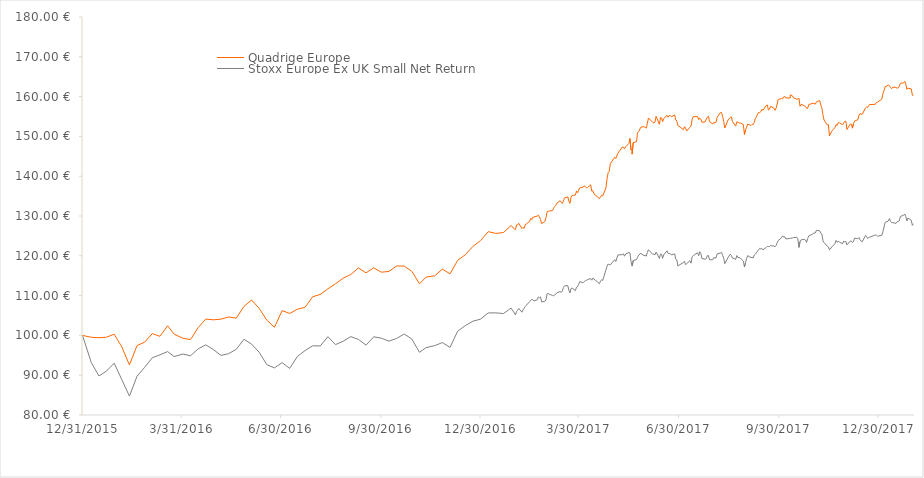
| Category |  Quadrige Europe     |  Stoxx Europe Ex UK Small Net Return  |
|---|---|---|
| 12/31/15 | 100 | 100 |
| 1/8/16 | 99.53 | 93.186 |
| 1/15/16 | 99.42 | 89.81 |
| 1/22/16 | 99.55 | 91.035 |
| 1/29/16 | 100.31 | 93.024 |
| 2/5/16 | 97.11 | 88.883 |
| 2/12/16 | 92.59 | 84.746 |
| 2/19/16 | 97.46 | 89.771 |
| 2/26/16 | 98.31 | 91.98 |
| 3/4/16 | 100.46 | 94.39 |
| 3/11/16 | 99.77 | 95.116 |
| 3/18/16 | 102.42 | 95.935 |
| 3/24/16 | 100.32 | 94.673 |
| 4/1/16 | 99.28 | 95.319 |
| 4/8/16 | 98.94 | 94.872 |
| 4/15/16 | 101.95 | 96.62 |
| 4/22/16 | 104.09 | 97.627 |
| 4/29/16 | 103.92 | 96.434 |
| 5/6/16 | 104.08 | 94.964 |
| 5/13/16 | 104.63 | 95.412 |
| 5/20/16 | 104.33 | 96.51 |
| 5/27/16 | 107.27 | 99.025 |
| 6/3/16 | 108.9 | 97.822 |
| 6/10/16 | 106.78 | 95.755 |
| 6/17/16 | 103.83 | 92.646 |
| 6/24/16 | 102.03 | 91.833 |
| 7/1/16 | 106.22 | 93.156 |
| 7/8/16 | 105.52 | 91.714 |
| 7/15/16 | 106.58 | 94.707 |
| 7/22/16 | 107.04 | 96.186 |
| 7/29/16 | 109.71 | 97.385 |
| 8/5/16 | 110.29 | 97.348 |
| 8/12/16 | 111.7 | 99.682 |
| 8/19/16 | 112.97 | 97.683 |
| 8/26/16 | 114.38 | 98.537 |
| 9/2/16 | 115.3 | 99.693 |
| 9/9/16 | 116.95 | 98.993 |
| 9/16/16 | 115.72 | 97.554 |
| 9/23/16 | 116.98 | 99.646 |
| 9/30/16 | 115.88 | 99.306 |
| 10/7/16 | 116.07 | 98.55 |
| 10/14/16 | 117.45 | 99.231 |
| 10/21/16 | 117.41 | 100.348 |
| 10/28/16 | 116.11 | 99.094 |
| 11/4/16 | 112.96 | 95.749 |
| 11/10/16 | 114.64 | 96.922 |
| 11/18/16 | 114.99 | 97.437 |
| 11/25/16 | 116.66 | 98.2 |
| 12/2/16 | 115.47 | 96.974 |
| 12/9/16 | 118.85 | 101.063 |
| 12/16/16 | 120.26 | 102.444 |
| 12/23/16 | 122.36 | 103.564 |
| 12/30/16 | 123.81 | 104.089 |
| 1/6/17 | 126.06 | 105.639 |
| 1/13/17 | 125.63 | 105.667 |
| 1/20/17 | 125.84 | 105.481 |
| 1/27/17 | 127.62 | 106.868 |
| 1/30/17 | 126.7 | 105.623 |
| 1/31/17 | 126.57 | 105.126 |
| 2/1/17 | 127.78 | 106.058 |
| 2/2/17 | 127.81 | 106.291 |
| 2/3/17 | 128.17 | 106.762 |
| 2/6/17 | 126.85 | 105.827 |
| 2/7/17 | 127.16 | 106.445 |
| 2/8/17 | 126.91 | 106.819 |
| 2/9/17 | 127.85 | 107.249 |
| 2/10/17 | 128 | 107.558 |
| 2/13/17 | 128.62 | 108.502 |
| 2/14/17 | 129.45 | 108.857 |
| 2/15/17 | 129.13 | 109.04 |
| 2/16/17 | 129.71 | 108.969 |
| 2/17/17 | 129.74 | 108.658 |
| 2/20/17 | 130 | 108.958 |
| 2/21/17 | 130.21 | 109.684 |
| 2/22/17 | 129.76 | 109.459 |
| 2/23/17 | 129.15 | 109.671 |
| 2/24/17 | 128.09 | 108.407 |
| 2/27/17 | 128.61 | 108.57 |
| 2/28/17 | 129.59 | 108.9 |
| 3/1/17 | 131.04 | 110.46 |
| 3/2/17 | 131.18 | 110.56 |
| 3/3/17 | 131.27 | 110.33 |
| 3/6/17 | 131.34 | 110.05 |
| 3/7/17 | 131.94 | 109.95 |
| 3/8/17 | 132.4 | 110.1 |
| 3/9/17 | 132.69 | 110.4 |
| 3/10/17 | 133.23 | 110.71 |
| 3/13/17 | 133.82 | 111 |
| 3/14/17 | 133.45 | 110.8 |
| 3/15/17 | 133.14 | 111.16 |
| 3/16/17 | 133.75 | 112.04 |
| 3/17/17 | 134.56 | 112.45 |
| 3/20/17 | 134.8 | 112.52 |
| 3/21/17 | 133.73 | 111.36 |
| 3/22/17 | 133.17 | 110.66 |
| 3/23/17 | 134.76 | 111.78 |
| 3/24/17 | 135.17 | 111.89 |
| 3/27/17 | 135.25 | 111.24 |
| 3/28/17 | 136.3 | 112.14 |
| 3/29/17 | 135.83 | 112.25 |
| 3/30/17 | 136.54 | 112.84 |
| 3/31/17 | 137.07 | 113.53 |
| 4/3/17 | 137.28 | 113.21 |
| 4/4/17 | 137.52 | 113.49 |
| 4/5/17 | 137.4 | 113.75 |
| 4/6/17 | 137.08 | 113.85 |
| 4/7/17 | 137.12 | 114 |
| 4/10/17 | 137.84 | 114.29 |
| 4/11/17 | 136.25 | 113.87 |
| 4/12/17 | 136.38 | 114.4 |
| 4/13/17 | 135.57 | 114.17 |
| 4/18/17 | 134.36 | 113.01 |
| 4/19/17 | 134.8 | 113.64 |
| 4/20/17 | 135.23 | 113.99 |
| 4/21/17 | 135 | 113.81 |
| 4/24/17 | 137.05 | 116.49 |
| 4/25/17 | 139.34 | 117.33 |
| 4/26/17 | 140.88 | 117.91 |
| 4/27/17 | 141.24 | 117.78 |
| 4/28/17 | 143.14 | 117.72 |
| 5/2/17 | 144.79 | 119.02 |
| 5/3/17 | 144.45 | 118.56 |
| 5/5/17 | 145.8 | 120.19 |
| 5/9/17 | 147.32 | 120.31 |
| 5/10/17 | 147.28 | 120.49 |
| 5/11/17 | 146.85 | 119.9 |
| 5/12/17 | 147.39 | 120.47 |
| 5/15/17 | 148.21 | 120.83 |
| 5/16/17 | 149.47 | 120.71 |
| 5/17/17 | 146.55 | 118.52 |
| 5/17/17 | 146.55 | 118.52 |
| 5/18/17 | 146.55 | 117.41 |
| 5/18/17 | 146.55 | 117.41 |
| 5/18/17 | 145.54 | 117.41 |
| 5/19/17 | 148.45 | 118.82 |
| 5/22/17 | 148.65 | 119.04 |
| 5/23/17 | 151 | 119.65 |
| 5/24/17 | 151.19 | 120.17 |
| 5/26/17 | 152.33 | 120.63 |
| 5/29/17 | 152.45 | 120.01 |
| 5/30/17 | 152.26 | 120.15 |
| 5/31/17 | 152.08 | 119.9 |
| 6/1/17 | 153.35 | 120.89 |
| 6/2/17 | 154.62 | 121.53 |
| 6/6/17 | 153.5 | 120.35 |
| 6/7/17 | 153.38 | 120.46 |
| 6/8/17 | 153.63 | 120.25 |
| 6/9/17 | 155.05 | 120.94 |
| 6/12/17 | 153.04 | 119.34 |
| 6/13/17 | 154.75 | 120.4 |
| 6/14/17 | 154.63 | 120.39 |
| 6/15/17 | 153.7 | 119.37 |
| 6/16/17 | 154.51 | 120.25 |
| 6/19/17 | 155.31 | 121.26 |
| 6/20/17 | 154.8 | 120.61 |
| 6/21/17 | 155.22 | 120.58 |
| 6/22/17 | 155.25 | 120.53 |
| 6/23/17 | 154.92 | 120.22 |
| 6/26/17 | 155.41 | 120.49 |
| 6/27/17 | 154.18 | 119.17 |
| 6/28/17 | 153.86 | 118.95 |
| 6/29/17 | 152.71 | 117.38 |
| 6/30/17 | 152.57 | 117.64 |
| 7/4/17 | 151.69 | 118.29 |
| 7/5/17 | 152.45 | 118.64 |
| 7/6/17 | 152.12 | 117.81 |
| 7/7/17 | 151.35 | 118 |
| 7/10/17 | 152.31 | 118.78 |
| 7/11/17 | 152.59 | 118.16 |
| 7/12/17 | 154.25 | 119.74 |
| 7/13/17 | 154.95 | 120.02 |
| 7/17/17 | 154.99 | 120.77 |
| 7/18/17 | 154.21 | 120.03 |
| 7/19/17 | 154.6 | 121.03 |
| 7/20/17 | 154.36 | 120.58 |
| 7/21/17 | 153.55 | 119.33 |
| 7/24/17 | 153.66 | 119.13 |
| 7/25/17 | 154.34 | 119.28 |
| 7/26/17 | 154.85 | 120.06 |
| 7/27/17 | 155.06 | 120.04 |
| 7/28/17 | 153.71 | 118.97 |
| 7/31/17 | 153.13 | 119.05 |
| 8/1/17 | 153.55 | 119.59 |
| 8/2/17 | 153.32 | 119.43 |
| 8/3/17 | 153.6 | 119.49 |
| 8/4/17 | 154.83 | 120.49 |
| 8/7/17 | 156.02 | 120.7 |
| 8/8/17 | 156.01 | 120.87 |
| 8/9/17 | 154.97 | 120.07 |
| 8/10/17 | 153.8 | 119.38 |
| 8/11/17 | 152.12 | 118.02 |
| 8/14/17 | 154.15 | 119.57 |
| 8/16/17 | 154.77 | 120.42 |
| 8/17/17 | 154.91 | 120.07 |
| 8/18/17 | 153.71 | 119.43 |
| 8/21/17 | 152.61 | 119.12 |
| 8/22/17 | 153.66 | 120.06 |
| 8/23/17 | 153.58 | 119.56 |
| 8/24/17 | 153.3 | 119.54 |
| 8/25/17 | 153.43 | 119.49 |
| 8/28/17 | 152.95 | 118.68 |
| 8/29/17 | 150.48 | 117.18 |
| 8/30/17 | 151.64 | 118.24 |
| 8/31/17 | 152.3 | 119.34 |
| 9/1/17 | 153.1 | 120.03 |
| 9/4/17 | 152.74 | 119.54 |
| 9/5/17 | 153.04 | 119.63 |
| 9/6/17 | 152.97 | 119.44 |
| 9/7/17 | 153.51 | 120.19 |
| 9/8/17 | 154.45 | 120.44 |
| 9/11/17 | 156.07 | 121.51 |
| 9/12/17 | 155.96 | 121.89 |
| 9/13/17 | 156.21 | 121.71 |
| 9/14/17 | 156.81 | 121.85 |
| 9/15/17 | 156.56 | 121.48 |
| 9/18/17 | 157.79 | 122.11 |
| 9/19/17 | 157.9 | 122.39 |
| 9/20/17 | 156.63 | 122.32 |
| 9/21/17 | 156.84 | 122.34 |
| 9/22/17 | 157.57 | 122.55 |
| 9/25/17 | 157.1 | 122.47 |
| 9/26/17 | 156.55 | 122.26 |
| 9/27/17 | 157.08 | 122.6 |
| 9/28/17 | 158.11 | 123.25 |
| 9/29/17 | 159.27 | 123.85 |
| 10/2/17 | 159.55 | 124.53 |
| 10/3/17 | 159.42 | 125.02 |
| 10/4/17 | 159.95 | 124.7 |
| 10/5/17 | 160.04 | 124.81 |
| 10/6/17 | 159.66 | 124.24 |
| 10/9/17 | 159.67 | 124.33 |
| 10/10/17 | 159.65 | 124.41 |
| 10/10/17 | 160.44 | 124.5 |
| 10/12/17 | 160.2 | 124.47 |
| 10/13/17 | 159.67 | 124.6 |
| 10/16/17 | 159.38 | 124.64 |
| 10/17/17 | 159.36 | 124.24 |
| 10/18/17 | 159.6 | 122.11 |
| 10/19/17 | 157.56 | 123.58 |
| 10/20/17 | 158.03 | 124.03 |
| 10/23/17 | 157.71 | 124.1 |
| 10/24/17 | 157.53 | 123.98 |
| 10/25/17 | 157.06 | 123.37 |
| 10/26/17 | 157.04 | 124.33 |
| 10/27/17 | 158 | 125 |
| 10/30/17 | 158.25 | 125.36 |
| 10/31/17 | 158.34 | 125.62 |
| 11/2/17 | 158.1 | 125.74 |
| 11/3/17 | 158.69 | 126.41 |
| 11/6/17 | 159 | 126.29 |
| 11/7/17 | 157.89 | 125.67 |
| 11/8/17 | 157.18 | 125.47 |
| 11/9/17 | 155.44 | 123.79 |
| 11/10/17 | 154.12 | 123.32 |
| 11/13/17 | 152.87 | 122.42 |
| 11/14/17 | 152.96 | 122.25 |
| 11/15/17 | 150.11 | 121.47 |
| 11/17/17 | 151.28 | 122.21 |
| 11/20/17 | 152.2 | 123.05 |
| 11/21/17 | 152.96 | 123.89 |
| 11/22/17 | 152.78 | 123.41 |
| 11/23/17 | 153.46 | 123.64 |
| 11/24/17 | 153.45 | 123.47 |
| 11/27/17 | 152.92 | 123.01 |
| 11/28/17 | 153.34 | 123.71 |
| 11/29/17 | 153.77 | 123.49 |
| 11/30/17 | 153.83 | 123.6 |
| 12/1/17 | 151.74 | 122.74 |
| 12/4/17 | 153.07 | 123.68 |
| 12/5/17 | 153.06 | 123.7 |
| 12/6/17 | 152.07 | 123.34 |
| 12/7/17 | 153.22 | 123.55 |
| 12/8/17 | 153.87 | 124.44 |
| 12/11/17 | 154.18 | 124.3 |
| 12/12/17 | 155.28 | 124.6 |
| 12/13/17 | 155.73 | 123.97 |
| 12/15/17 | 155.52 | 123.51 |
| 12/18/17 | 157.15 | 125.08 |
| 12/19/17 | 157.42 | 124.89 |
| 12/20/17 | 157.24 | 124.33 |
| 12/21/17 | 157.82 | 124.59 |
| 12/22/17 | 158.01 | 124.7 |
| 12/27/17 | 158.05 | 125.23 |
| 12/28/17 | 158.56 | 125.17 |
| 12/29/17 | 158.6 | 124.92 |
| 1/2/18 | 159.35 | 125.14 |
| 1/3/18 | 160.75 | 126.06 |
| 1/4/18 | 161.48 | 127.25 |
| 1/5/18 | 162.45 | 128.39 |
| 1/5/18 | 162.45 | 128.39 |
| 1/8/18 | 162.89 | 128.75 |
| 1/9/18 | 162.74 | 129.37 |
| 1/10/18 | 162.23 | 128.64 |
| 1/11/18 | 161.99 | 128.32 |
| 1/12/18 | 162.36 | 128.33 |
| 1/15/18 | 162.33 | 128.15 |
| 1/16/18 | 162.08 | 128.54 |
| 1/17/18 | 162.2 | 128.64 |
| 1/18/18 | 162.6 | 128.79 |
| 1/19/18 | 163.33 | 129.88 |
| 1/22/18 | 163.47 | 130.19 |
| 1/23/18 | 163.83 | 130.51 |
| 1/24/18 | 163.19 | 129.82 |
| 1/25/18 | 161.82 | 128.76 |
| 1/26/18 | 162.11 | 129.49 |
| 1/29/18 | 161.93 | 128.91 |
| 1/30/18 | 160.41 | 127.65 |
| 1/31/18 | 160.13 | 128.06 |